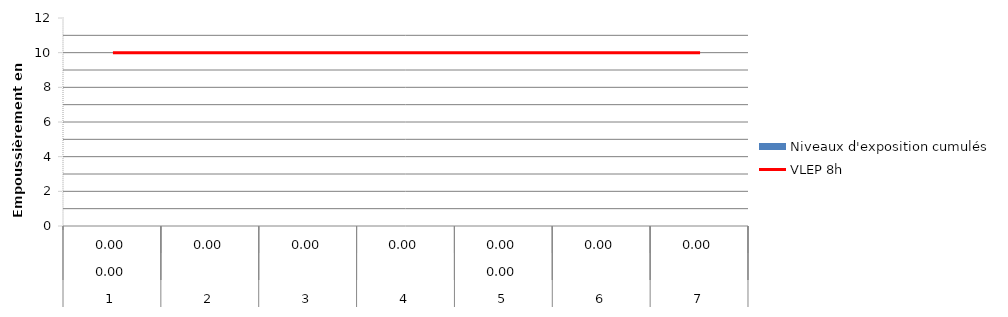
| Category | VLEP 8h |
|---|---|
| 0 | 10 |
| 1 | 10 |
| 2 | 10 |
| 3 | 10 |
| 4 | 10 |
| 5 | 10 |
| 6 | 10 |